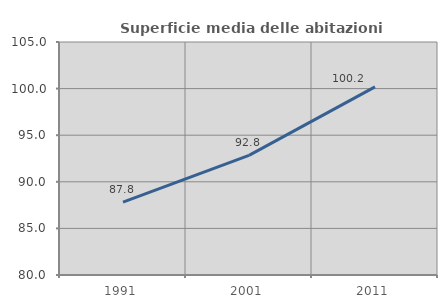
| Category | Superficie media delle abitazioni occupate |
|---|---|
| 1991.0 | 87.816 |
| 2001.0 | 92.838 |
| 2011.0 | 100.178 |